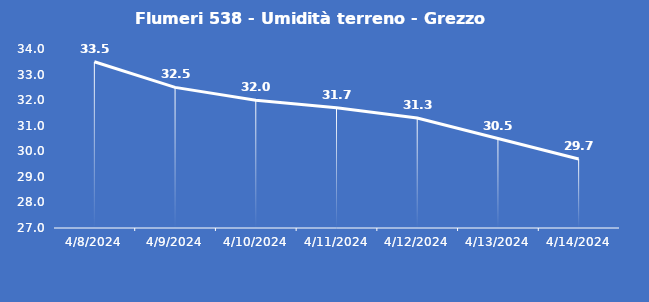
| Category | Flumeri 538 - Umidità terreno - Grezzo (%VWC) |
|---|---|
| 4/8/24 | 33.5 |
| 4/9/24 | 32.5 |
| 4/10/24 | 32 |
| 4/11/24 | 31.7 |
| 4/12/24 | 31.3 |
| 4/13/24 | 30.5 |
| 4/14/24 | 29.7 |